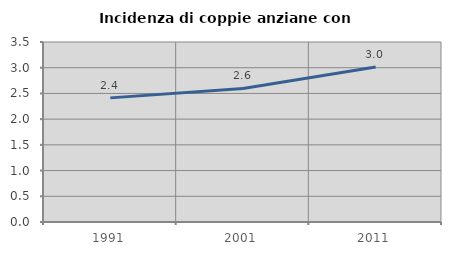
| Category | Incidenza di coppie anziane con figli |
|---|---|
| 1991.0 | 2.413 |
| 2001.0 | 2.596 |
| 2011.0 | 3.012 |